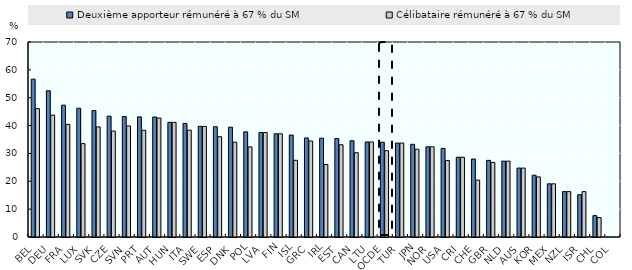
| Category | Deuxième apporteur rémunéré à 67 % du SM | Célibataire rémunéré à 67 % du SM |
|---|---|---|
| BEL | 56.666 | 46.081 |
| DEU | 52.488 | 43.734 |
| FRA | 47.324 | 40.427 |
| LUX | 46.221 | 33.522 |
| SVK | 45.369 | 39.523 |
| CZE | 43.395 | 38.016 |
| SVN | 43.242 | 39.86 |
| PRT | 43.136 | 38.335 |
| AUT | 43.069 | 42.711 |
| HUN | 41.15 | 41.15 |
| ITA | 40.773 | 38.368 |
| SWE | 39.714 | 39.714 |
| ESP | 39.586 | 36.008 |
| DNK | 39.417 | 34.024 |
| POL | 37.74 | 32.352 |
| LVA | 37.496 | 37.496 |
| FIN | 37.051 | 37.051 |
| ISL | 36.611 | 27.532 |
| GRC | 35.55 | 34.457 |
| IRL | 35.476 | 26.019 |
| EST | 35.341 | 33.11 |
| CAN | 34.555 | 30.256 |
| LTU | 34.117 | 34.117 |
| OCDE | 34.031 | 30.973 |
| TUR | 33.721 | 33.721 |
| JPN | 33.276 | 31.511 |
| NOR | 32.377 | 32.377 |
| USA | 31.803 | 27.472 |
| CRI | 28.633 | 28.633 |
| CHE | 27.996 | 20.406 |
| GBR | 27.505 | 26.795 |
| NLD | 27.233 | 27.233 |
| AUS | 24.742 | 24.742 |
| KOR | 22.182 | 21.572 |
| MEX | 19.083 | 19.083 |
| NZL | 16.292 | 16.292 |
| ISR | 15.174 | 16.284 |
| CHL | 7.671 | 7 |
| COL | 0 | 0 |